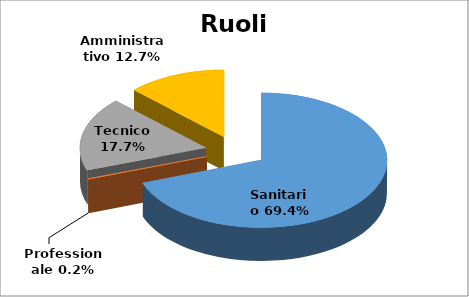
| Category | Series 0 |
|---|---|
| Sanitario | 0.694 |
| Professionale | 0.002 |
| Tecnico | 0.177 |
| Amministrativo | 0.127 |